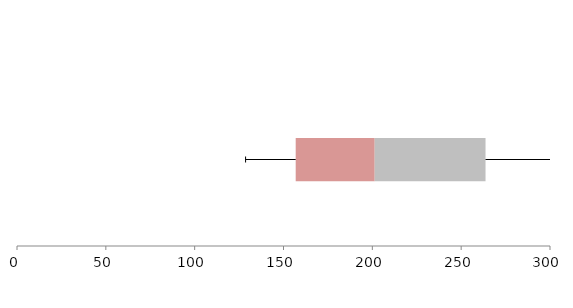
| Category | Series 1 | Series 2 | Series 3 |
|---|---|---|---|
| 0 | 156.866 | 44.476 | 62.374 |